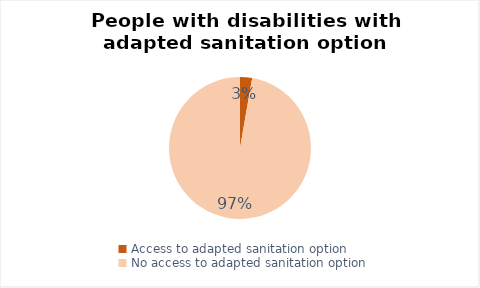
| Category | Series 0 |
|---|---|
| Access to adapted sanitation option | 401 |
| No access to adapted sanitation option | 14179 |